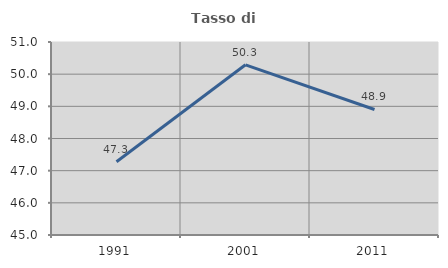
| Category | Tasso di occupazione   |
|---|---|
| 1991.0 | 47.278 |
| 2001.0 | 50.291 |
| 2011.0 | 48.902 |